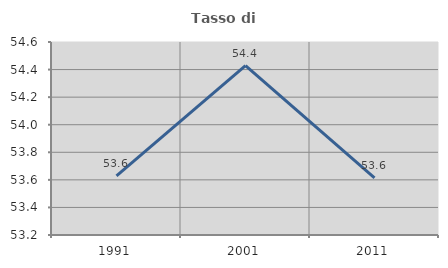
| Category | Tasso di occupazione   |
|---|---|
| 1991.0 | 53.629 |
| 2001.0 | 54.429 |
| 2011.0 | 53.614 |